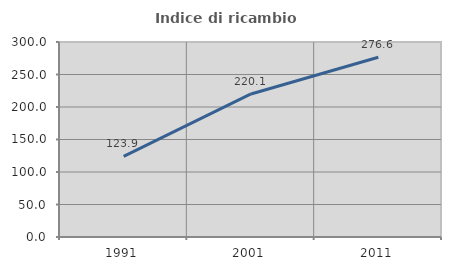
| Category | Indice di ricambio occupazionale  |
|---|---|
| 1991.0 | 123.906 |
| 2001.0 | 220.079 |
| 2011.0 | 276.636 |